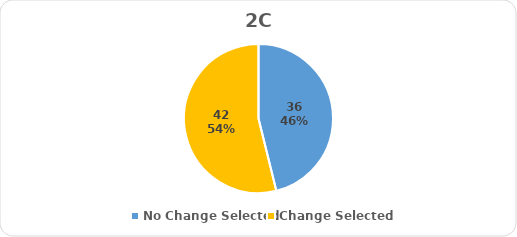
| Category | Series 0 |
|---|---|
| No Change Selected | 36 |
| Change Selected | 42 |